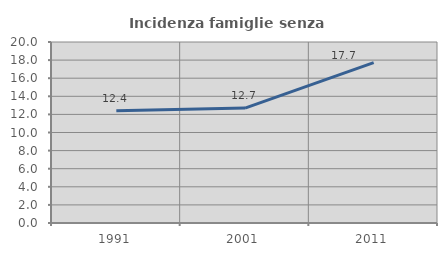
| Category | Incidenza famiglie senza nuclei |
|---|---|
| 1991.0 | 12.397 |
| 2001.0 | 12.695 |
| 2011.0 | 17.713 |